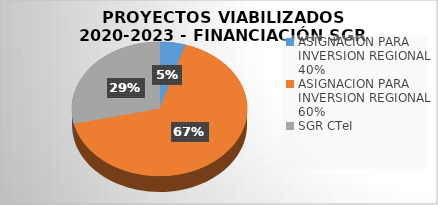
| Category | Series 0 |
|---|---|
| ASIGNACION PARA INVERSION REGIONAL 40% | 1 |
| ASIGNACION PARA INVERSION REGIONAL 60% | 14 |
| SGR CTeI | 6 |